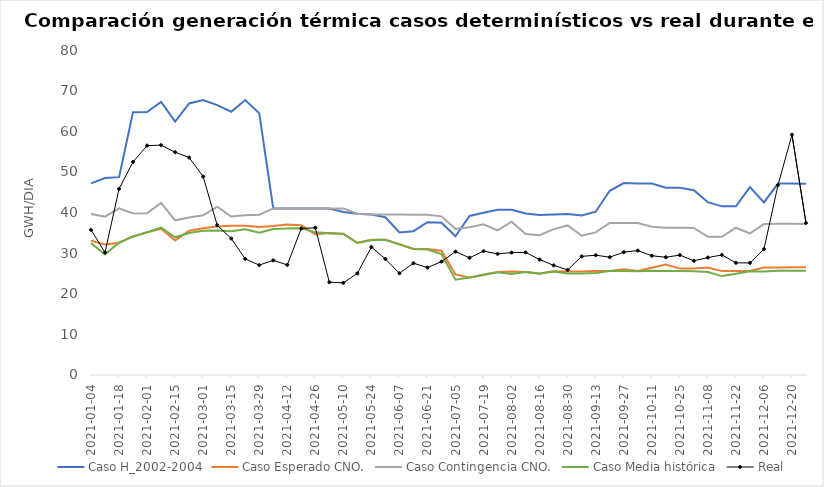
| Category | Caso H_2002-2004 | Caso Esperado CNO. | Caso Contingencia CNO. | Caso Media histórica | Real |
|---|---|---|---|---|---|
| 2021-01-04 | 47.169 | 33.064 | 39.653 | 32.437 | 35.735 |
| 2021-01-11 | 48.483 | 32.13 | 38.987 | 29.696 | 30.158 |
| 2021-01-18 | 48.704 | 32.561 | 41.021 | 32.563 | 45.82 |
| 2021-01-25 | 64.701 | 34.106 | 39.757 | 34.107 | 52.452 |
| 2021-02-01 | 64.747 | 35.106 | 39.841 | 35.151 | 56.46 |
| 2021-02-08 | 67.204 | 35.999 | 42.344 | 36.277 | 56.579 |
| 2021-02-15 | 62.377 | 33.086 | 38.077 | 33.89 | 54.838 |
| 2021-02-22 | 66.849 | 35.53 | 38.753 | 34.95 | 53.525 |
| 2021-03-01 | 67.677 | 36.131 | 39.327 | 35.487 | 48.835 |
| 2021-03-08 | 66.449 | 36.541 | 41.447 | 35.543 | 36.877 |
| 2021-03-15 | 64.809 | 36.709 | 39 | 35.367 | 33.613 |
| 2021-03-22 | 67.67 | 36.756 | 39.331 | 35.874 | 28.591 |
| 2021-03-29 | 64.45 | 36.413 | 39.474 | 35.007 | 27.051 |
| 2021-04-05 | 40.99 | 36.664 | 41.006 | 35.924 | 28.217 |
| 2021-04-12 | 40.986 | 37.036 | 41.007 | 36.084 | 27.1 |
| 2021-04-19 | 40.981 | 36.867 | 41.001 | 36.097 | 36.069 |
| 2021-04-26 | 40.99 | 34.617 | 40.997 | 35.116 | 36.247 |
| 2021-05-03 | 40.993 | 34.94 | 41.007 | 34.871 | 22.842 |
| 2021-05-10 | 40.106 | 34.796 | 41 | 34.734 | 22.678 |
| 2021-05-17 | 39.7 | 32.54 | 39.697 | 32.483 | 25.019 |
| 2021-05-24 | 39.5 | 33.267 | 39.493 | 33.239 | 31.503 |
| 2021-05-31 | 38.834 | 33.297 | 39.493 | 33.28 | 28.558 |
| 2021-06-07 | 35.094 | 32.174 | 39.489 | 32.157 | 25.039 |
| 2021-06-14 | 35.396 | 30.999 | 39.423 | 30.999 | 27.526 |
| 2021-06-21 | 37.593 | 30.999 | 39.423 | 30.894 | 26.445 |
| 2021-06-28 | 37.467 | 30.587 | 39.047 | 29.769 | 27.906 |
| 2021-07-05 | 34.136 | 24.753 | 35.971 | 23.464 | 30.374 |
| 2021-07-12 | 39.141 | 23.964 | 36.346 | 23.993 | 28.844 |
| 2021-07-19 | 39.939 | 24.76 | 37.073 | 24.606 | 30.5 |
| 2021-07-26 | 40.673 | 25.366 | 35.61 | 25.304 | 29.814 |
| 2021-08-02 | 40.669 | 25.491 | 37.74 | 24.866 | 30.135 |
| 2021-08-09 | 39.761 | 25.347 | 34.719 | 25.347 | 30.175 |
| 2021-08-16 | 39.399 | 24.937 | 34.41 | 24.971 | 28.413 |
| 2021-08-23 | 39.511 | 25.541 | 35.909 | 25.474 | 26.996 |
| 2021-08-30 | 39.619 | 25.491 | 36.81 | 24.979 | 25.859 |
| 2021-09-06 | 39.264 | 25.491 | 34.276 | 24.999 | 29.196 |
| 2021-09-13 | 40.197 | 25.594 | 35.096 | 25.081 | 29.494 |
| 2021-09-20 | 45.34 | 25.597 | 37.431 | 25.61 | 28.998 |
| 2021-09-27 | 47.254 | 26.023 | 37.431 | 25.597 | 30.23 |
| 2021-10-04 | 47.15 | 25.597 | 37.431 | 25.569 | 30.631 |
| 2021-10-11 | 47.154 | 26.41 | 36.476 | 25.674 | 29.348 |
| 2021-10-18 | 46.096 | 27.187 | 36.273 | 25.609 | 28.982 |
| 2021-10-25 | 46.096 | 26.189 | 36.273 | 25.597 | 29.518 |
| 2021-11-01 | 45.479 | 26.189 | 36.204 | 25.546 | 28.11 |
| 2021-11-08 | 42.547 | 26.434 | 34.011 | 25.337 | 28.9 |
| 2021-11-15 | 41.509 | 25.574 | 34.011 | 24.347 | 29.56 |
| 2021-11-22 | 41.509 | 25.597 | 36.253 | 24.939 | 27.615 |
| 2021-11-29 | 46.243 | 25.597 | 34.839 | 25.541 | 27.593 |
| 2021-12-06 | 42.507 | 26.463 | 37.141 | 25.504 | 30.956 |
| 2021-12-13 | 47.127 | 26.471 | 37.211 | 25.664 | 46.719 |
| 2021-12-20 | 47.127 | 26.501 | 37.211 | 25.646 | 59.151 |
| 2021-12-27 | 47.097 | 26.494 | 37.17 | 25.636 | 37.443 |